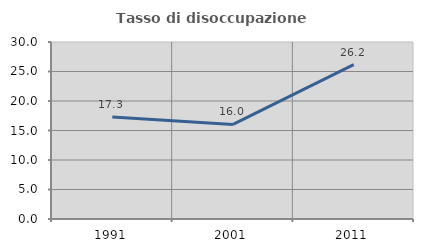
| Category | Tasso di disoccupazione giovanile  |
|---|---|
| 1991.0 | 17.282 |
| 2001.0 | 16.023 |
| 2011.0 | 26.174 |